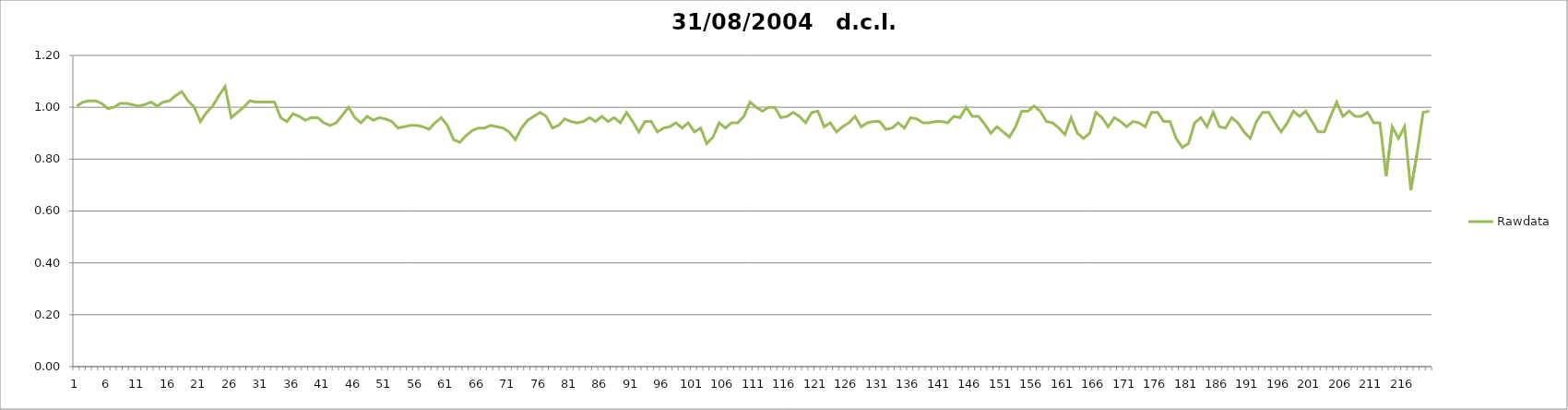
| Category | Rawdata |
|---|---|
| 0 | 1.005 |
| 1 | 1.02 |
| 2 | 1.025 |
| 3 | 1.025 |
| 4 | 1.015 |
| 5 | 0.995 |
| 6 | 1 |
| 7 | 1.015 |
| 8 | 1.015 |
| 9 | 1.01 |
| 10 | 1.005 |
| 11 | 1.01 |
| 12 | 1.02 |
| 13 | 1.005 |
| 14 | 1.02 |
| 15 | 1.025 |
| 16 | 1.045 |
| 17 | 1.06 |
| 18 | 1.025 |
| 19 | 1 |
| 20 | 0.945 |
| 21 | 0.98 |
| 22 | 1.005 |
| 23 | 1.045 |
| 24 | 1.08 |
| 25 | 0.96 |
| 26 | 0.98 |
| 27 | 1 |
| 28 | 1.025 |
| 29 | 1.02 |
| 30 | 1.02 |
| 31 | 1.02 |
| 32 | 1.02 |
| 33 | 0.96 |
| 34 | 0.945 |
| 35 | 0.975 |
| 36 | 0.965 |
| 37 | 0.95 |
| 38 | 0.96 |
| 39 | 0.96 |
| 40 | 0.94 |
| 41 | 0.93 |
| 42 | 0.94 |
| 43 | 0.97 |
| 44 | 1 |
| 45 | 0.96 |
| 46 | 0.94 |
| 47 | 0.965 |
| 48 | 0.95 |
| 49 | 0.96 |
| 50 | 0.955 |
| 51 | 0.945 |
| 52 | 0.92 |
| 53 | 0.925 |
| 54 | 0.93 |
| 55 | 0.93 |
| 56 | 0.925 |
| 57 | 0.915 |
| 58 | 0.94 |
| 59 | 0.96 |
| 60 | 0.93 |
| 61 | 0.875 |
| 62 | 0.865 |
| 63 | 0.89 |
| 64 | 0.91 |
| 65 | 0.92 |
| 66 | 0.92 |
| 67 | 0.93 |
| 68 | 0.925 |
| 69 | 0.92 |
| 70 | 0.905 |
| 71 | 0.875 |
| 72 | 0.92 |
| 73 | 0.95 |
| 74 | 0.965 |
| 75 | 0.98 |
| 76 | 0.965 |
| 77 | 0.92 |
| 78 | 0.93 |
| 79 | 0.955 |
| 80 | 0.945 |
| 81 | 0.94 |
| 82 | 0.945 |
| 83 | 0.96 |
| 84 | 0.945 |
| 85 | 0.965 |
| 86 | 0.945 |
| 87 | 0.96 |
| 88 | 0.94 |
| 89 | 0.98 |
| 90 | 0.945 |
| 91 | 0.905 |
| 92 | 0.945 |
| 93 | 0.945 |
| 94 | 0.905 |
| 95 | 0.92 |
| 96 | 0.925 |
| 97 | 0.94 |
| 98 | 0.92 |
| 99 | 0.94 |
| 100 | 0.905 |
| 101 | 0.92 |
| 102 | 0.86 |
| 103 | 0.885 |
| 104 | 0.94 |
| 105 | 0.92 |
| 106 | 0.94 |
| 107 | 0.94 |
| 108 | 0.965 |
| 109 | 1.02 |
| 110 | 1 |
| 111 | 0.985 |
| 112 | 1 |
| 113 | 1 |
| 114 | 0.96 |
| 115 | 0.965 |
| 116 | 0.98 |
| 117 | 0.965 |
| 118 | 0.94 |
| 119 | 0.98 |
| 120 | 0.985 |
| 121 | 0.925 |
| 122 | 0.94 |
| 123 | 0.905 |
| 124 | 0.925 |
| 125 | 0.94 |
| 126 | 0.965 |
| 127 | 0.925 |
| 128 | 0.94 |
| 129 | 0.945 |
| 130 | 0.945 |
| 131 | 0.915 |
| 132 | 0.92 |
| 133 | 0.94 |
| 134 | 0.92 |
| 135 | 0.96 |
| 136 | 0.955 |
| 137 | 0.94 |
| 138 | 0.94 |
| 139 | 0.945 |
| 140 | 0.945 |
| 141 | 0.94 |
| 142 | 0.965 |
| 143 | 0.96 |
| 144 | 1 |
| 145 | 0.965 |
| 146 | 0.965 |
| 147 | 0.935 |
| 148 | 0.9 |
| 149 | 0.925 |
| 150 | 0.905 |
| 151 | 0.885 |
| 152 | 0.925 |
| 153 | 0.985 |
| 154 | 0.985 |
| 155 | 1.005 |
| 156 | 0.985 |
| 157 | 0.945 |
| 158 | 0.94 |
| 159 | 0.92 |
| 160 | 0.895 |
| 161 | 0.96 |
| 162 | 0.9 |
| 163 | 0.88 |
| 164 | 0.9 |
| 165 | 0.98 |
| 166 | 0.96 |
| 167 | 0.925 |
| 168 | 0.96 |
| 169 | 0.945 |
| 170 | 0.925 |
| 171 | 0.945 |
| 172 | 0.94 |
| 173 | 0.925 |
| 174 | 0.98 |
| 175 | 0.98 |
| 176 | 0.945 |
| 177 | 0.945 |
| 178 | 0.88 |
| 179 | 0.845 |
| 180 | 0.86 |
| 181 | 0.94 |
| 182 | 0.96 |
| 183 | 0.925 |
| 184 | 0.98 |
| 185 | 0.925 |
| 186 | 0.92 |
| 187 | 0.96 |
| 188 | 0.94 |
| 189 | 0.905 |
| 190 | 0.88 |
| 191 | 0.945 |
| 192 | 0.98 |
| 193 | 0.98 |
| 194 | 0.94 |
| 195 | 0.905 |
| 196 | 0.94 |
| 197 | 0.985 |
| 198 | 0.965 |
| 199 | 0.985 |
| 200 | 0.945 |
| 201 | 0.905 |
| 202 | 0.905 |
| 203 | 0.965 |
| 204 | 1.02 |
| 205 | 0.965 |
| 206 | 0.985 |
| 207 | 0.965 |
| 208 | 0.965 |
| 209 | 0.98 |
| 210 | 0.94 |
| 211 | 0.94 |
| 212 | 0.735 |
| 213 | 0.925 |
| 214 | 0.88 |
| 215 | 0.925 |
| 216 | 0.68 |
| 217 | 0.82 |
| 218 | 0.98 |
| 219 | 0.985 |